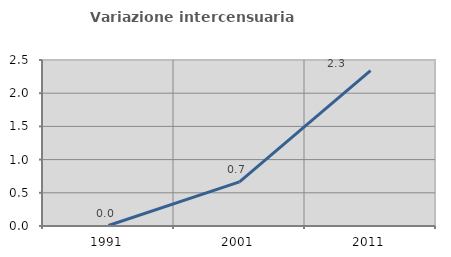
| Category | Variazione intercensuaria annua |
|---|---|
| 1991.0 | 0.007 |
| 2001.0 | 0.665 |
| 2011.0 | 2.34 |